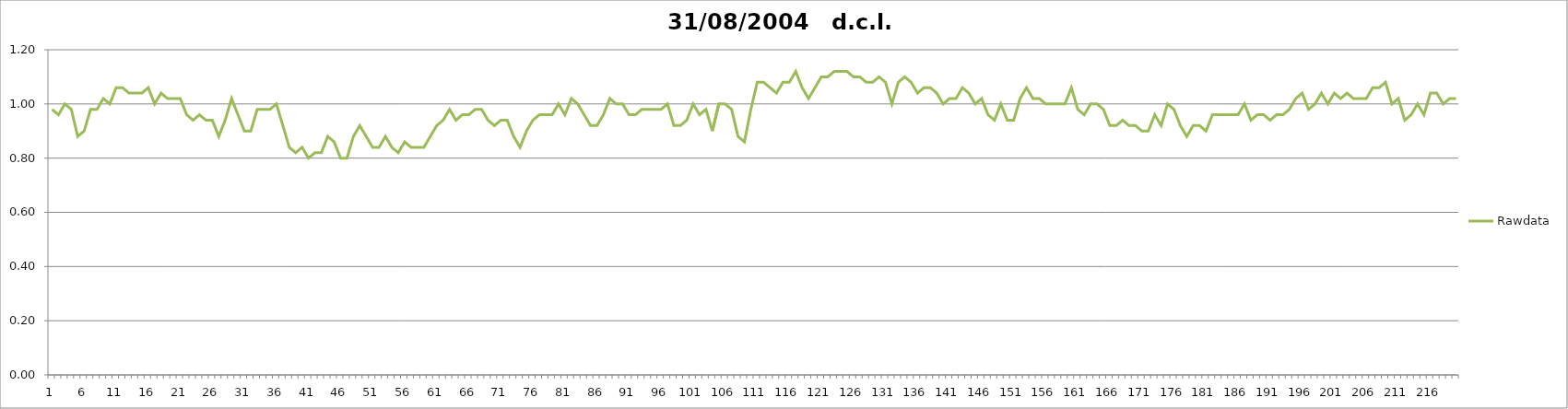
| Category | Rawdata |
|---|---|
| 0 | 0.98 |
| 1 | 0.96 |
| 2 | 1 |
| 3 | 0.98 |
| 4 | 0.88 |
| 5 | 0.9 |
| 6 | 0.98 |
| 7 | 0.98 |
| 8 | 1.02 |
| 9 | 1 |
| 10 | 1.06 |
| 11 | 1.06 |
| 12 | 1.04 |
| 13 | 1.04 |
| 14 | 1.04 |
| 15 | 1.06 |
| 16 | 1 |
| 17 | 1.04 |
| 18 | 1.02 |
| 19 | 1.02 |
| 20 | 1.02 |
| 21 | 0.96 |
| 22 | 0.94 |
| 23 | 0.96 |
| 24 | 0.94 |
| 25 | 0.94 |
| 26 | 0.88 |
| 27 | 0.94 |
| 28 | 1.02 |
| 29 | 0.96 |
| 30 | 0.9 |
| 31 | 0.9 |
| 32 | 0.98 |
| 33 | 0.98 |
| 34 | 0.98 |
| 35 | 1 |
| 36 | 0.92 |
| 37 | 0.84 |
| 38 | 0.82 |
| 39 | 0.84 |
| 40 | 0.8 |
| 41 | 0.82 |
| 42 | 0.82 |
| 43 | 0.88 |
| 44 | 0.86 |
| 45 | 0.8 |
| 46 | 0.8 |
| 47 | 0.88 |
| 48 | 0.92 |
| 49 | 0.88 |
| 50 | 0.84 |
| 51 | 0.84 |
| 52 | 0.88 |
| 53 | 0.84 |
| 54 | 0.82 |
| 55 | 0.86 |
| 56 | 0.84 |
| 57 | 0.84 |
| 58 | 0.84 |
| 59 | 0.88 |
| 60 | 0.92 |
| 61 | 0.94 |
| 62 | 0.98 |
| 63 | 0.94 |
| 64 | 0.96 |
| 65 | 0.96 |
| 66 | 0.98 |
| 67 | 0.98 |
| 68 | 0.94 |
| 69 | 0.92 |
| 70 | 0.94 |
| 71 | 0.94 |
| 72 | 0.88 |
| 73 | 0.84 |
| 74 | 0.9 |
| 75 | 0.94 |
| 76 | 0.96 |
| 77 | 0.96 |
| 78 | 0.96 |
| 79 | 1 |
| 80 | 0.96 |
| 81 | 1.02 |
| 82 | 1 |
| 83 | 0.96 |
| 84 | 0.92 |
| 85 | 0.92 |
| 86 | 0.96 |
| 87 | 1.02 |
| 88 | 1 |
| 89 | 1 |
| 90 | 0.96 |
| 91 | 0.96 |
| 92 | 0.98 |
| 93 | 0.98 |
| 94 | 0.98 |
| 95 | 0.98 |
| 96 | 1 |
| 97 | 0.92 |
| 98 | 0.92 |
| 99 | 0.94 |
| 100 | 1 |
| 101 | 0.96 |
| 102 | 0.98 |
| 103 | 0.9 |
| 104 | 1 |
| 105 | 1 |
| 106 | 0.98 |
| 107 | 0.88 |
| 108 | 0.86 |
| 109 | 0.98 |
| 110 | 1.08 |
| 111 | 1.08 |
| 112 | 1.06 |
| 113 | 1.04 |
| 114 | 1.08 |
| 115 | 1.08 |
| 116 | 1.12 |
| 117 | 1.06 |
| 118 | 1.02 |
| 119 | 1.06 |
| 120 | 1.1 |
| 121 | 1.1 |
| 122 | 1.12 |
| 123 | 1.12 |
| 124 | 1.12 |
| 125 | 1.1 |
| 126 | 1.1 |
| 127 | 1.08 |
| 128 | 1.08 |
| 129 | 1.1 |
| 130 | 1.08 |
| 131 | 1 |
| 132 | 1.08 |
| 133 | 1.1 |
| 134 | 1.08 |
| 135 | 1.04 |
| 136 | 1.06 |
| 137 | 1.06 |
| 138 | 1.04 |
| 139 | 1 |
| 140 | 1.02 |
| 141 | 1.02 |
| 142 | 1.06 |
| 143 | 1.04 |
| 144 | 1 |
| 145 | 1.02 |
| 146 | 0.96 |
| 147 | 0.94 |
| 148 | 1 |
| 149 | 0.94 |
| 150 | 0.94 |
| 151 | 1.02 |
| 152 | 1.06 |
| 153 | 1.02 |
| 154 | 1.02 |
| 155 | 1 |
| 156 | 1 |
| 157 | 1 |
| 158 | 1 |
| 159 | 1.06 |
| 160 | 0.98 |
| 161 | 0.96 |
| 162 | 1 |
| 163 | 1 |
| 164 | 0.98 |
| 165 | 0.92 |
| 166 | 0.92 |
| 167 | 0.94 |
| 168 | 0.92 |
| 169 | 0.92 |
| 170 | 0.9 |
| 171 | 0.9 |
| 172 | 0.96 |
| 173 | 0.92 |
| 174 | 1 |
| 175 | 0.98 |
| 176 | 0.92 |
| 177 | 0.88 |
| 178 | 0.92 |
| 179 | 0.92 |
| 180 | 0.9 |
| 181 | 0.96 |
| 182 | 0.96 |
| 183 | 0.96 |
| 184 | 0.96 |
| 185 | 0.96 |
| 186 | 1 |
| 187 | 0.94 |
| 188 | 0.96 |
| 189 | 0.96 |
| 190 | 0.94 |
| 191 | 0.96 |
| 192 | 0.96 |
| 193 | 0.98 |
| 194 | 1.02 |
| 195 | 1.04 |
| 196 | 0.98 |
| 197 | 1 |
| 198 | 1.04 |
| 199 | 1 |
| 200 | 1.04 |
| 201 | 1.02 |
| 202 | 1.04 |
| 203 | 1.02 |
| 204 | 1.02 |
| 205 | 1.02 |
| 206 | 1.06 |
| 207 | 1.06 |
| 208 | 1.08 |
| 209 | 1 |
| 210 | 1.02 |
| 211 | 0.94 |
| 212 | 0.96 |
| 213 | 1 |
| 214 | 0.96 |
| 215 | 1.04 |
| 216 | 1.04 |
| 217 | 1 |
| 218 | 1.02 |
| 219 | 1.02 |